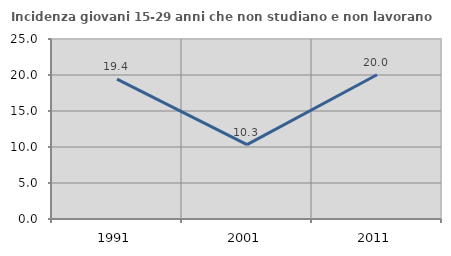
| Category | Incidenza giovani 15-29 anni che non studiano e non lavorano  |
|---|---|
| 1991.0 | 19.439 |
| 2001.0 | 10.324 |
| 2011.0 | 20.031 |